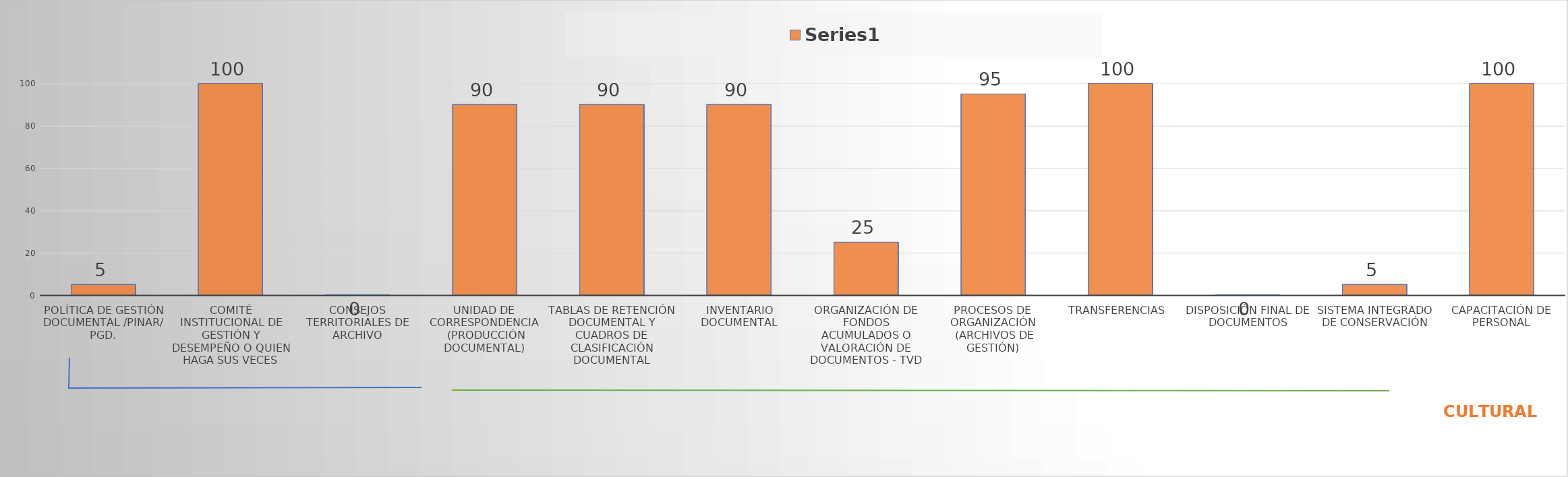
| Category | Series 0 |
|---|---|
| Política de Gestión Documental /PINAR/ PGD. | 5 |
| Comité Institucional de Gestión y Desempeño o quien haga sus veces | 100 |
| Consejos Territoriales de Archivo | 0 |
| Unidad de Correspondencia
 (PRODUCCIÓN DOCUMENTAL) | 90 |
| Tablas de Retención Documental y Cuadros de Clasificación Documental | 90 |
| Inventario Documental | 90 |
| Organización de Fondos Acumulados o valoración de documentos - TVD | 25 |
| Procesos de Organización
 (Archivos de Gestión) | 95 |
| Transferencias  | 100 |
| Disposición Final de Documentos | 0 |
| Sistema Integrado de Conservación | 5 |
| Capacitación de Personal | 100 |